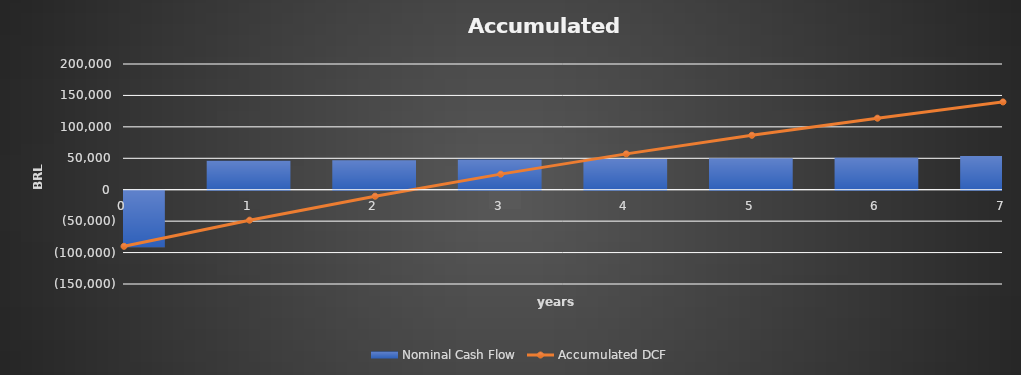
| Category | Nominal Cash Flow |
|---|---|
| 0.0 | -90000 |
| 1.0 | 46100 |
| 2.0 | 47022 |
| 3.0 | 47962.44 |
| 4.0 | 48921.689 |
| 5.0 | 49900.123 |
| 6.0 | 50898.125 |
| 7.0 | 53625.205 |